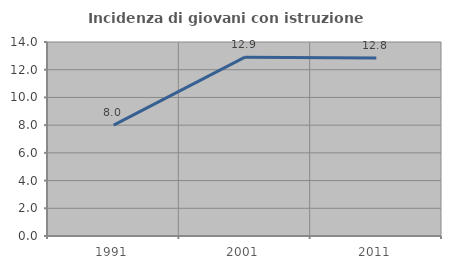
| Category | Incidenza di giovani con istruzione universitaria |
|---|---|
| 1991.0 | 8 |
| 2001.0 | 12.903 |
| 2011.0 | 12.844 |